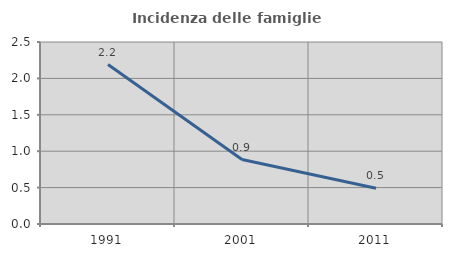
| Category | Incidenza delle famiglie numerose |
|---|---|
| 1991.0 | 2.19 |
| 2001.0 | 0.885 |
| 2011.0 | 0.49 |